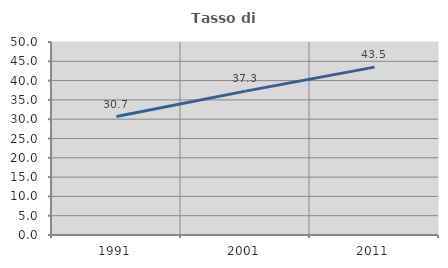
| Category | Tasso di occupazione   |
|---|---|
| 1991.0 | 30.675 |
| 2001.0 | 37.276 |
| 2011.0 | 43.496 |